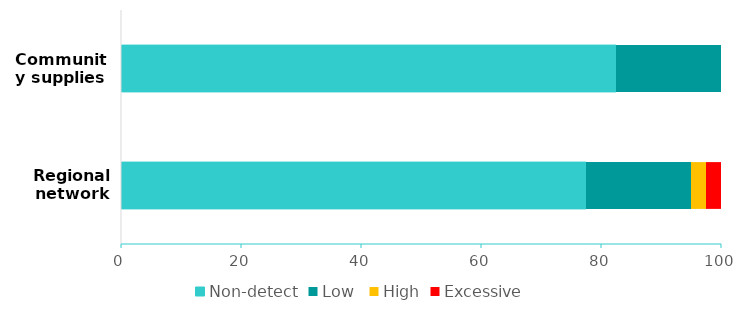
| Category | Non-detect | Low  | High | Excessive    |
|---|---|---|---|---|
| Regional network | 77.5 | 17.5 | 2.5 | 2.5 |
| Community supplies | 82.5 | 17.5 | 0 | 0 |